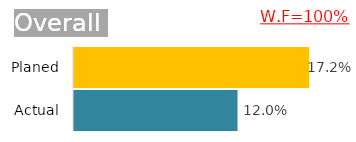
| Category | Overall |
|---|---|
| Actual | 0.12 |
| Planed | 0.172 |